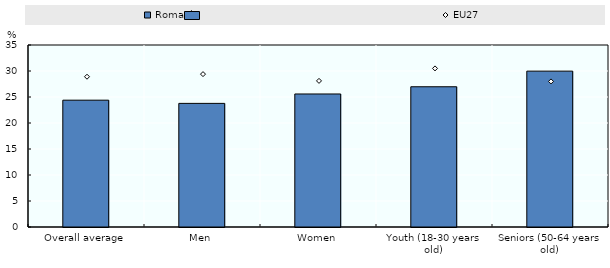
| Category | Romania |
|---|---|
| Overall average | 24.389 |
| Men | 23.771 |
| Women | 25.581 |
| Youth (18-30 years old) | 26.968 |
| Seniors (50-64 years old) | 29.976 |